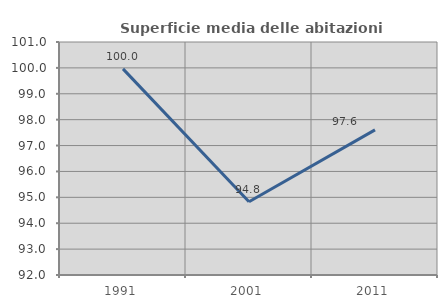
| Category | Superficie media delle abitazioni occupate |
|---|---|
| 1991.0 | 99.962 |
| 2001.0 | 94.828 |
| 2011.0 | 97.605 |